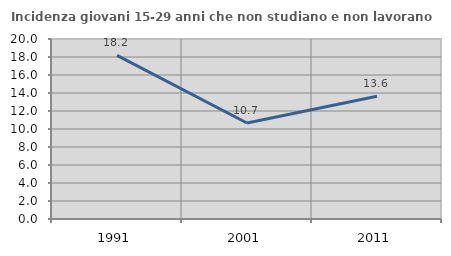
| Category | Incidenza giovani 15-29 anni che non studiano e non lavorano  |
|---|---|
| 1991.0 | 18.182 |
| 2001.0 | 10.669 |
| 2011.0 | 13.629 |